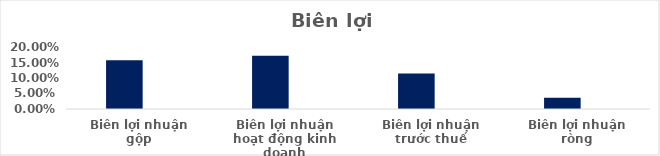
| Category | Series 0 | Series 1 | Series 2 | Series 3 | Series 4 |
|---|---|---|---|---|---|
| Biên lợi nhuận gộp | 0.157 |  |  |  |  |
| Biên lợi nhuận hoạt động kinh doanh | 0.172 |  |  |  |  |
| Biên lợi nhuận trước thuế | 0.114 |  |  |  |  |
| Biên lợi nhuận ròng | 0.037 |  |  |  |  |